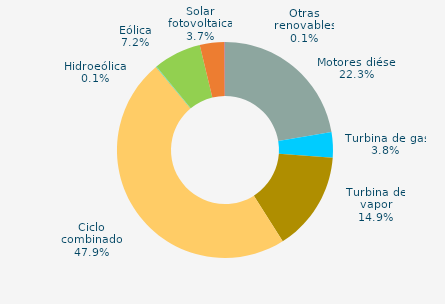
| Category | Series 0 |
|---|---|
| Motores diésel | 22.323 |
| Turbina de gas | 3.82 |
| Turbina de vapor | 14.886 |
| Ciclo combinado | 47.935 |
| Cogeneración | 0 |
| Hidráulica | 0.038 |
| Hidroeólica | 0.055 |
| Eólica | 7.184 |
| Solar fotovoltaica | 3.694 |
| Otras renovables | 0.065 |